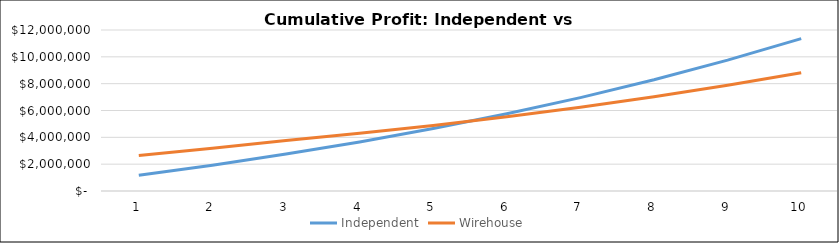
| Category | Independent | Wirehouse |
|---|---|---|
| 0 | 1175000 | 2646000 |
| 1 | 1925000 | 3186000 |
| 2 | 2750000 | 3770000 |
| 3 | 3657500 | 4302400 |
| 4 | 4655750 | 4888040 |
| 5 | 5753825 | 5532244 |
| 6 | 6961707.5 | 6240868.4 |
| 7 | 8290378.25 | 7020355.24 |
| 8 | 9751916.075 | 7877790.764 |
| 9 | 11359607.683 | 8820969.84 |